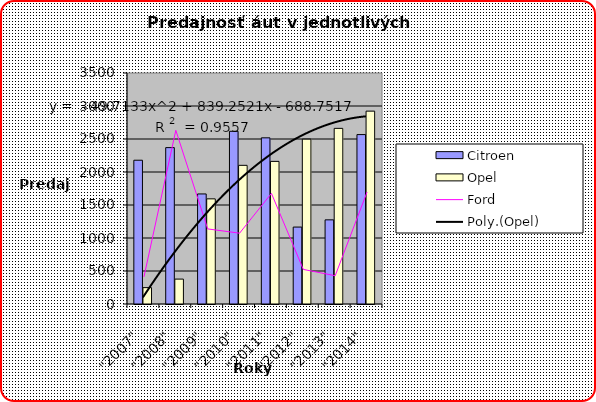
| Category | Citroen | Opel |
|---|---|---|
| "2007" | 2178.405 | 247.982 |
| "2008" | 2369.512 | 377.227 |
| "2009" | 1667.576 | 1593.214 |
| "2010" | 2616.503 | 2100.898 |
| "2011" | 2517.64 | 2160.829 |
| "2012" | 1165.534 | 2498.022 |
| "2013" | 1274.964 | 2661.05 |
| "2014" | 2566.977 | 2922.338 |